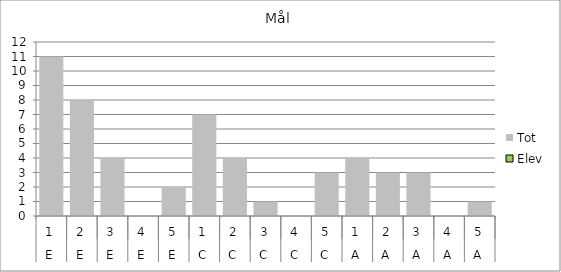
| Category | Tot | Elev |
|---|---|---|
| 0 | 11 | 0 |
| 1 | 8 | 0 |
| 2 | 4 | 0 |
| 3 | 0 | 0 |
| 4 | 2 | 0 |
| 5 | 7 | 0 |
| 6 | 4 | 0 |
| 7 | 1 | 0 |
| 8 | 0 | 0 |
| 9 | 3 | 0 |
| 10 | 4 | 0 |
| 11 | 3 | 0 |
| 12 | 3 | 0 |
| 13 | 0 | 0 |
| 14 | 1 | 0 |